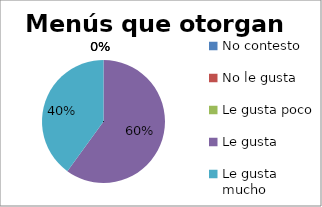
| Category | Series 0 |
|---|---|
| No contesto | 0 |
| No le gusta | 0 |
| Le gusta poco | 0 |
| Le gusta | 3 |
| Le gusta mucho | 2 |